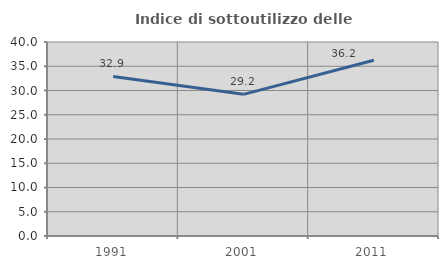
| Category | Indice di sottoutilizzo delle abitazioni  |
|---|---|
| 1991.0 | 32.903 |
| 2001.0 | 29.21 |
| 2011.0 | 36.228 |